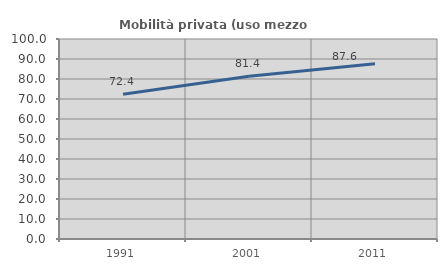
| Category | Mobilità privata (uso mezzo privato) |
|---|---|
| 1991.0 | 72.352 |
| 2001.0 | 81.361 |
| 2011.0 | 87.618 |